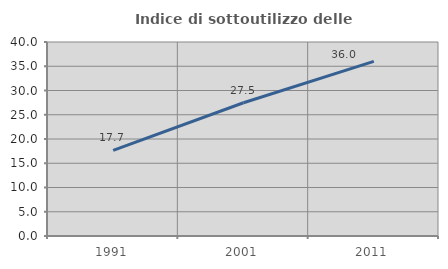
| Category | Indice di sottoutilizzo delle abitazioni  |
|---|---|
| 1991.0 | 17.662 |
| 2001.0 | 27.476 |
| 2011.0 | 36.005 |